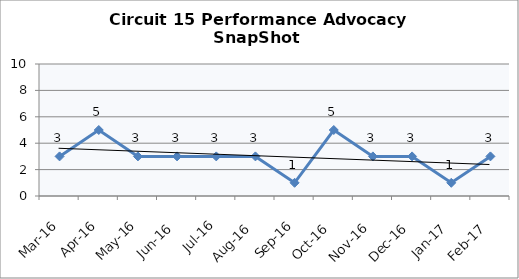
| Category | Circuit 15 |
|---|---|
| Mar-16 | 3 |
| Apr-16 | 5 |
| May-16 | 3 |
| Jun-16 | 3 |
| Jul-16 | 3 |
| Aug-16 | 3 |
| Sep-16 | 1 |
| Oct-16 | 5 |
| Nov-16 | 3 |
| Dec-16 | 3 |
| Jan-17 | 1 |
| Feb-17 | 3 |